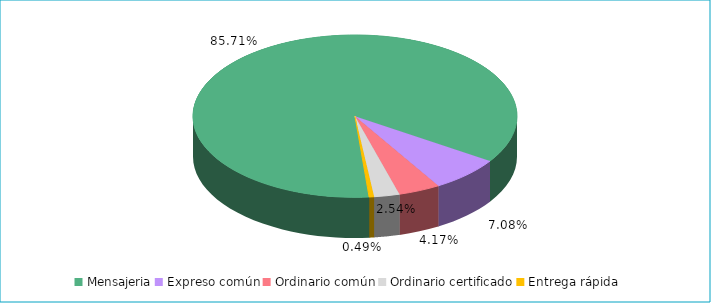
| Category | Series 0 |
|---|---|
| Mensajeria | 0.857 |
| Expreso común | 0.071 |
| Ordinario común | 0.042 |
| Ordinario certificado | 0.025 |
| Entrega rápida | 0.005 |